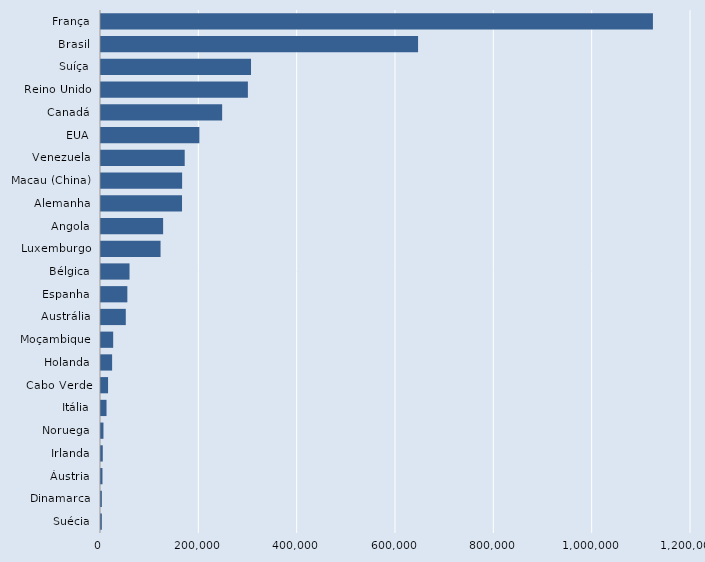
| Category | Series 0 |
|---|---|
| Suécia | 1702 |
| Dinamarca | 1735 |
| Áustria | 2994 |
| Irlanda | 3612 |
| Noruega | 5001 |
| Itália | 11258 |
| Cabo Verde | 14380 |
| Holanda | 22621 |
| Moçambique | 24779 |
| Austrália | 50428 |
| Espanha | 53600 |
| Bélgica | 58020 |
| Luxemburgo | 121127 |
| Angola | 126356 |
| Alemanha | 164799 |
| Macau (China) | 165000 |
| Venezuela | 170267 |
| EUA | 200070 |
| Canadá | 246432 |
| Reino Unido | 298760 |
| Suíça | 305128 |
| Brasil | 644903 |
| França | 1122564 |